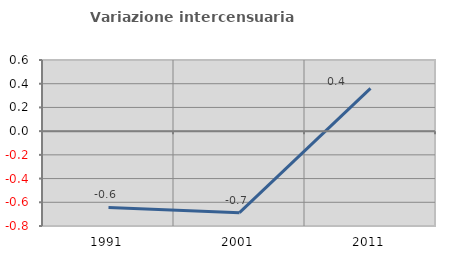
| Category | Variazione intercensuaria annua |
|---|---|
| 1991.0 | -0.643 |
| 2001.0 | -0.688 |
| 2011.0 | 0.361 |